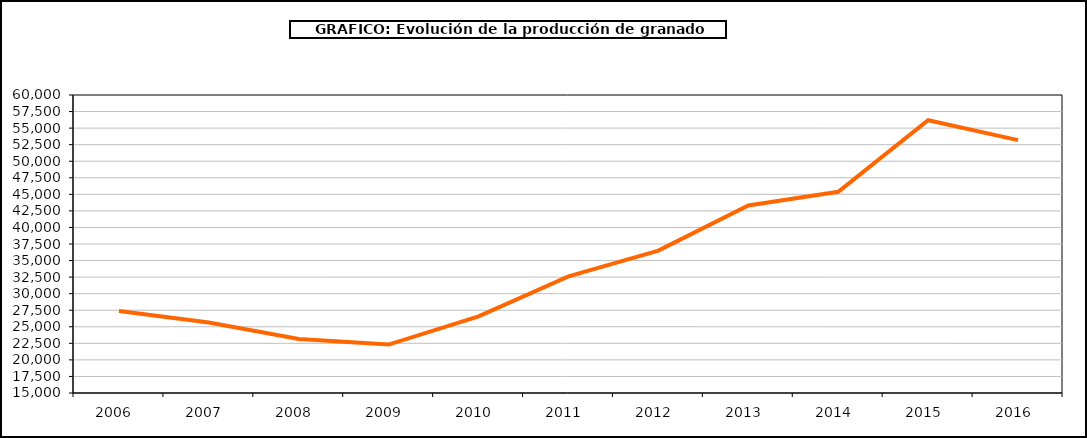
| Category | producción granado |
|---|---|
| 2006.0 | 27389 |
| 2007.0 | 25632 |
| 2008.0 | 23169 |
| 2009.0 | 22311 |
| 2010.0 | 26582 |
| 2011.0 | 32606 |
| 2012.0 | 36495 |
| 2013.0 | 43324 |
| 2014.0 | 45382 |
| 2015.0 | 56185 |
| 2016.0 | 53187 |